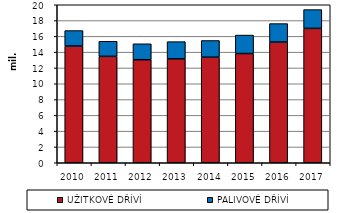
| Category | UŽITKOVÉ DŘÍVÍ | PALIVOVÉ DŘÍVÍ |
|---|---|---|
| 2010.0 | 14771 | 1965 |
| 2011.0 | 13467 | 1914 |
| 2012.0 | 13041 | 2020 |
| 2013.0 | 13149 | 2182 |
| 2014.0 | 13365 | 2111 |
| 2015.0 | 13827 | 2336 |
| 2016.0 | 15273 | 2344 |
| 2017.0 | 17011 | 2376 |